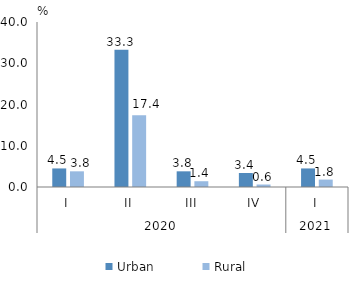
| Category | Urban | Rural |
|---|---|---|
| 0 | 4.5 | 3.8 |
| 1 | 33.3 | 17.4 |
| 2 | 3.8 | 1.4 |
| 3 | 3.4 | 0.6 |
| 4 | 4.5 | 1.8 |